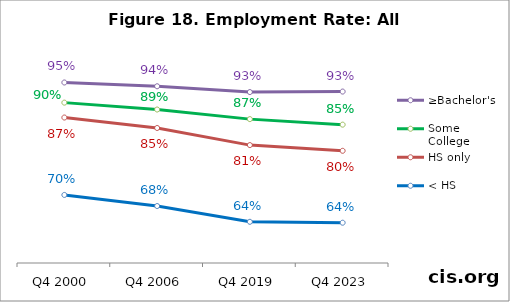
| Category | ≥Bachelor's | Some College | HS only | < HS |
|---|---|---|---|---|
| Q4 2000 | 0.948 | 0.903 | 0.87 | 0.7 |
| Q4 2006 | 0.939 | 0.888 | 0.847 | 0.675 |
| Q4 2019 | 0.926 | 0.867 | 0.81 | 0.641 |
| Q4 2023 | 0.928 | 0.855 | 0.797 | 0.639 |